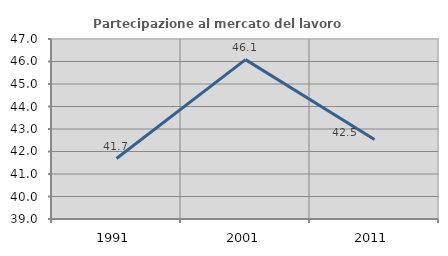
| Category | Partecipazione al mercato del lavoro  femminile |
|---|---|
| 1991.0 | 41.687 |
| 2001.0 | 46.083 |
| 2011.0 | 42.534 |